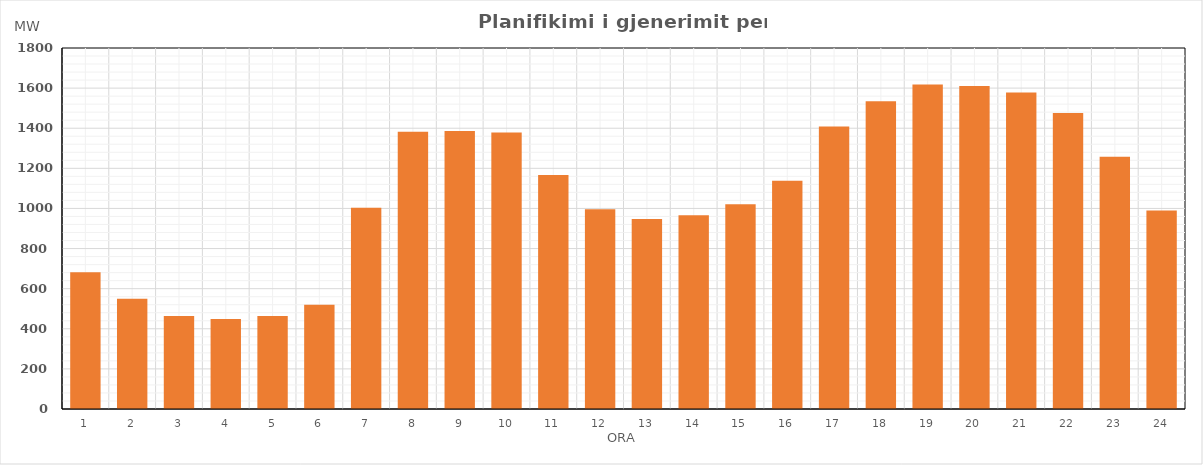
| Category | Max (MW) |
|---|---|
| 0 | 682.04 |
| 1 | 549.37 |
| 2 | 464.15 |
| 3 | 449.14 |
| 4 | 464.33 |
| 5 | 519.24 |
| 6 | 1003.55 |
| 7 | 1381.92 |
| 8 | 1386.47 |
| 9 | 1378.49 |
| 10 | 1166.78 |
| 11 | 996.42 |
| 12 | 947.14 |
| 13 | 966.45 |
| 14 | 1020.41 |
| 15 | 1137.73 |
| 16 | 1409.06 |
| 17 | 1534.78 |
| 18 | 1617.5 |
| 19 | 1610.12 |
| 20 | 1577.93 |
| 21 | 1476.12 |
| 22 | 1258.13 |
| 23 | 990.06 |